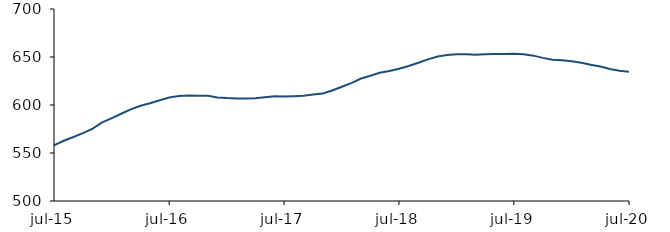
| Category | Series 0 |
|---|---|
| 2015-07-01 | 557.917 |
| 2015-08-01 | 562.75 |
| 2015-09-01 | 566.667 |
| 2015-10-01 | 570.667 |
| 2015-11-01 | 575.417 |
| 2015-12-01 | 581.833 |
| 2016-01-01 | 586.417 |
| 2016-02-01 | 591.167 |
| 2016-03-01 | 595.5 |
| 2016-04-01 | 599.167 |
| 2016-05-01 | 601.833 |
| 2016-06-01 | 605 |
| 2016-07-01 | 607.75 |
| 2016-08-01 | 609.25 |
| 2016-09-01 | 609.917 |
| 2016-10-01 | 609.667 |
| 2016-11-01 | 609.583 |
| 2016-12-01 | 607.917 |
| 2017-01-01 | 607.167 |
| 2017-02-01 | 606.833 |
| 2017-03-01 | 606.667 |
| 2017-04-01 | 606.917 |
| 2017-05-01 | 608.083 |
| 2017-06-01 | 609.083 |
| 2017-07-01 | 608.833 |
| 2017-08-01 | 609.167 |
| 2017-09-01 | 609.667 |
| 2017-10-01 | 610.833 |
| 2017-11-01 | 612 |
| 2017-12-01 | 615.167 |
| 2018-01-01 | 619 |
| 2018-02-01 | 623.083 |
| 2018-03-01 | 627.333 |
| 2018-04-01 | 630.5 |
| 2018-05-01 | 633.5 |
| 2018-06-01 | 635.5 |
| 2018-07-01 | 637.75 |
| 2018-08-01 | 640.583 |
| 2018-09-01 | 644 |
| 2018-10-01 | 647.5 |
| 2018-11-01 | 650.417 |
| 2018-12-01 | 652.167 |
| 2019-01-01 | 652.917 |
| 2019-02-01 | 652.75 |
| 2019-03-01 | 652.417 |
| 2019-04-01 | 652.833 |
| 2019-05-01 | 653.167 |
| 2019-06-01 | 653.25 |
| 2019-07-01 | 653.5 |
| 2019-08-01 | 652.75 |
| 2019-09-01 | 651.417 |
| 2019-10-01 | 649.083 |
| 2019-11-01 | 647.167 |
| 2019-12-01 | 646.667 |
| 2020-01-01 | 645.583 |
| 2020-02-01 | 644 |
| 2020-03-01 | 642 |
| 2020-04-01 | 640.083 |
| 2020-05-01 | 637.583 |
| 2020-06-01 | 635.75 |
| 2020-07-01 | 634.5 |